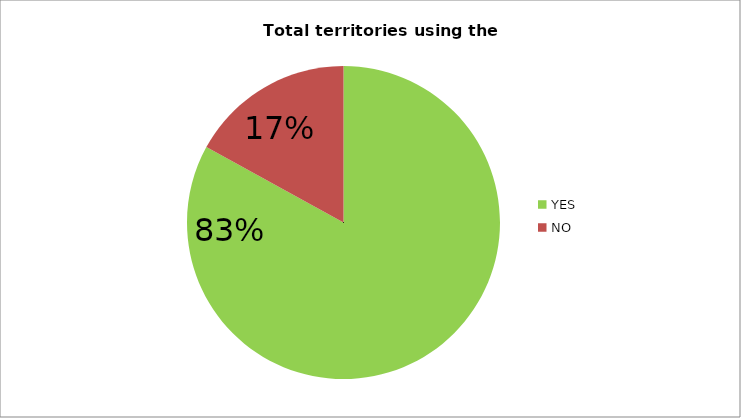
| Category | Total territories using the portal  |
|---|---|
| YES | 0.83 |
| NO | 0.17 |